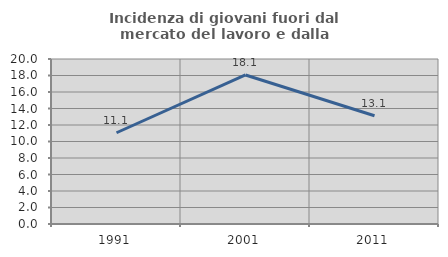
| Category | Incidenza di giovani fuori dal mercato del lavoro e dalla formazione  |
|---|---|
| 1991.0 | 11.061 |
| 2001.0 | 18.062 |
| 2011.0 | 13.123 |